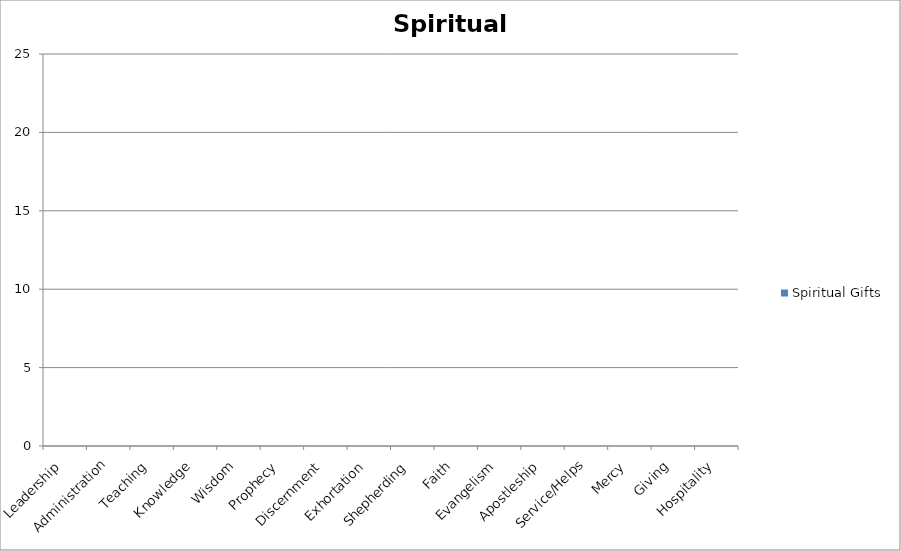
| Category | Spiritual Gifts |
|---|---|
| Leadership | 0 |
| Administration | 0 |
| Teaching | 0 |
| Knowledge | 0 |
| Wisdom | 0 |
| Prophecy | 0 |
| Discernment | 0 |
| Exhortation | 0 |
| Shepherding | 0 |
| Faith | 0 |
| Evangelism | 0 |
| Apostleship | 0 |
| Service/Helps | 0 |
| Mercy | 0 |
| Giving | 0 |
| Hospitality | 0 |